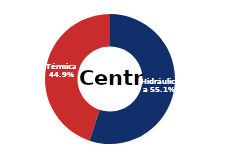
| Category | Centro |
|---|---|
| Eólica | 0 |
| Hidráulica | 2149.493 |
| Solar | 0 |
| Térmica | 1749.93 |